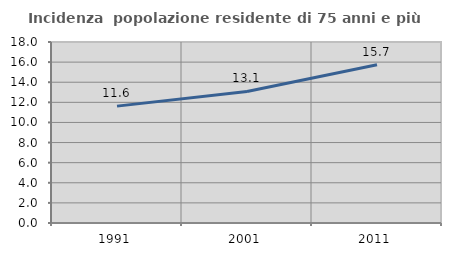
| Category | Incidenza  popolazione residente di 75 anni e più |
|---|---|
| 1991.0 | 11.624 |
| 2001.0 | 13.079 |
| 2011.0 | 15.728 |